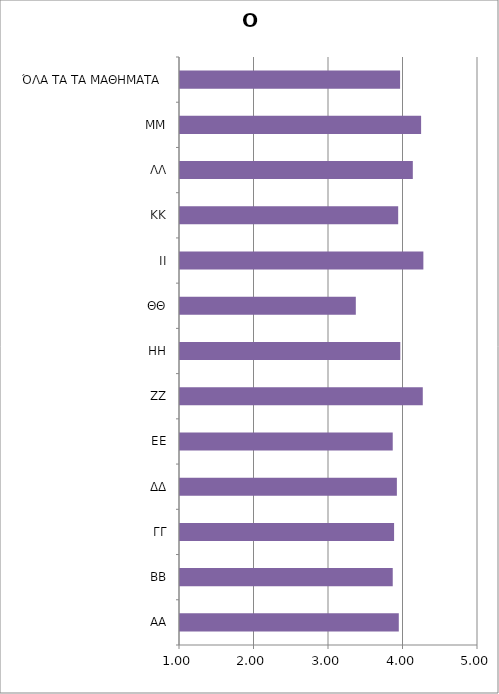
| Category | Ο Φοιτητής |
|---|---|
| ΑΑ | 3.937 |
| ΒΒ | 3.856 |
| ΓΓ | 3.874 |
| ΔΔ | 3.911 |
| ΕΕ | 3.856 |
| ΖΖ | 4.259 |
| ΗΗ | 3.957 |
| ΘΘ | 3.36 |
| ΙΙ | 4.267 |
| ΚΚ | 3.929 |
| ΛΛ | 4.125 |
| ΜΜ | 4.236 |
| ΌΛΑ ΤΑ ΤΑ ΜΑΘΗΜΑΤΑ  | 3.954 |